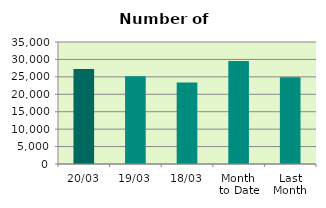
| Category | Series 0 |
|---|---|
| 20/03 | 27252 |
| 19/03 | 25196 |
| 18/03 | 23368 |
| Month 
to Date | 29573.429 |
| Last
Month | 24872.2 |